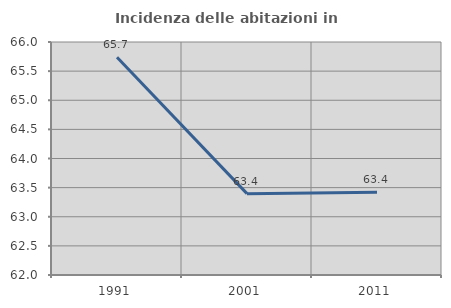
| Category | Incidenza delle abitazioni in proprietà  |
|---|---|
| 1991.0 | 65.737 |
| 2001.0 | 63.397 |
| 2011.0 | 63.421 |